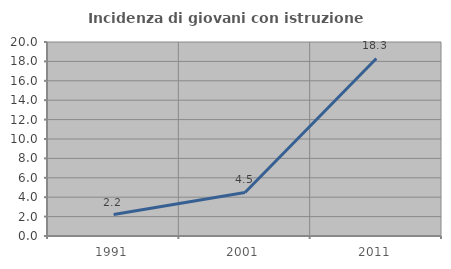
| Category | Incidenza di giovani con istruzione universitaria |
|---|---|
| 1991.0 | 2.208 |
| 2001.0 | 4.486 |
| 2011.0 | 18.307 |